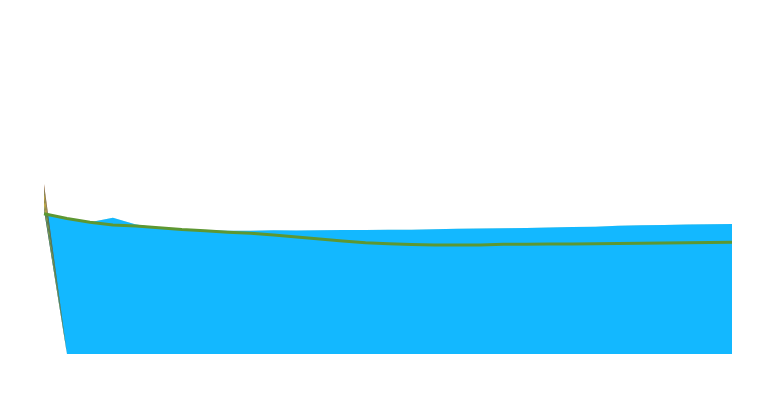
| Category | North America Ref |
|---|---|
| 2020.0 | -2.218 |
| 2021.0 | -3.504 |
| 2022.0 | -4.502 |
| 2023.0 | -5.258 |
| 2024.0 | -5.49 |
| 2025.0 | -5.958 |
| 2026.0 | -6.458 |
| 2027.0 | -6.799 |
| 2028.0 | -7.17 |
| 2029.0 | -7.447 |
| 2030.0 | -7.937 |
| 2031.0 | -8.495 |
| 2032.0 | -9.005 |
| 2033.0 | -9.545 |
| 2034.0 | -10.001 |
| 2035.0 | -10.302 |
| 2036.0 | -10.512 |
| 2037.0 | -10.644 |
| 2038.0 | -10.623 |
| 2039.0 | -10.598 |
| 2040.0 | -10.445 |
| 2041.0 | -10.403 |
| 2042.0 | -10.392 |
| 2043.0 | -10.352 |
| 2044.0 | -10.307 |
| 2045.0 | -10.231 |
| 2046.0 | -10.147 |
| 2047.0 | -10.095 |
| 2048.0 | -10.028 |
| 2049.0 | -9.95 |
| 2050.0 | -9.916 |